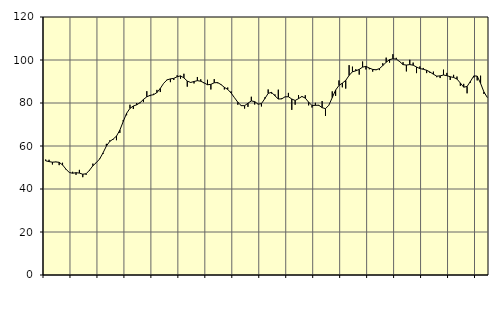
| Category | Piggar | Series 1 |
|---|---|---|
| nan | 53.7 | 53.11 |
| 87.0 | 53.6 | 52.75 |
| 87.0 | 51.4 | 52.47 |
| 87.0 | 52.7 | 52.59 |
| nan | 51.1 | 52.42 |
| 88.0 | 52.2 | 51.21 |
| 88.0 | 49.1 | 49.26 |
| 88.0 | 47.6 | 47.66 |
| nan | 48 | 47.34 |
| 89.0 | 46.6 | 47.58 |
| 89.0 | 48.9 | 47.41 |
| 89.0 | 45.5 | 46.87 |
| nan | 46.6 | 47.09 |
| 90.0 | 48.5 | 48.74 |
| 90.0 | 51.8 | 50.79 |
| 90.0 | 52.1 | 52.25 |
| nan | 54.1 | 53.95 |
| 91.0 | 56.3 | 56.77 |
| 91.0 | 61 | 59.95 |
| 91.0 | 62.6 | 62.14 |
| nan | 63 | 63.2 |
| 92.0 | 62.7 | 64.6 |
| 92.0 | 66.1 | 67.39 |
| 92.0 | 72.1 | 71.39 |
| nan | 74.3 | 75.21 |
| 93.0 | 79.2 | 77.5 |
| 93.0 | 77.2 | 78.6 |
| 93.0 | 80 | 79.16 |
| nan | 79.9 | 80.17 |
| 94.0 | 80.4 | 81.65 |
| 94.0 | 85.5 | 82.88 |
| 94.0 | 83.2 | 83.59 |
| nan | 84.3 | 83.87 |
| 95.0 | 86.1 | 84.85 |
| 95.0 | 85.1 | 86.79 |
| 95.0 | 89.2 | 89.17 |
| nan | 90.9 | 90.75 |
| 96.0 | 89.7 | 91.22 |
| 96.0 | 90.7 | 91.46 |
| 96.0 | 92.9 | 92.21 |
| nan | 91.3 | 92.62 |
| 97.0 | 93.6 | 91.69 |
| 97.0 | 87.6 | 90.2 |
| 97.0 | 89.7 | 89.55 |
| nan | 89.1 | 90 |
| 98.0 | 92.1 | 90.39 |
| 98.0 | 91 | 90.12 |
| 98.0 | 89.2 | 89.36 |
| nan | 90.8 | 88.49 |
| 99.0 | 86.3 | 88.67 |
| 99.0 | 91.1 | 89.41 |
| 99.0 | 89.2 | 89.5 |
| nan | 88.4 | 88.58 |
| 0.0 | 86.3 | 87.29 |
| 0.0 | 87.2 | 86.32 |
| 0.0 | 85.4 | 84.65 |
| nan | 82.5 | 82.47 |
| 1.0 | 79.2 | 80.34 |
| 1.0 | 79 | 78.79 |
| 1.0 | 77.4 | 78.75 |
| nan | 78.2 | 79.91 |
| 2.0 | 82.9 | 80.96 |
| 2.0 | 79.3 | 80.65 |
| 2.0 | 79.6 | 79.46 |
| nan | 78.4 | 79.72 |
| 3.0 | 82.6 | 82.02 |
| 3.0 | 86.3 | 84.48 |
| 3.0 | 84.4 | 84.96 |
| nan | 84 | 83.35 |
| 4.0 | 86.2 | 81.86 |
| 4.0 | 82.2 | 81.92 |
| 4.0 | 82.8 | 82.87 |
| nan | 84.7 | 82.92 |
| 5.0 | 76.8 | 81.85 |
| 5.0 | 79.2 | 81.19 |
| 5.0 | 83.7 | 82.03 |
| nan | 82.8 | 83.04 |
| 6.0 | 83.6 | 82.28 |
| 6.0 | 78.9 | 80.36 |
| 6.0 | 77.9 | 78.85 |
| nan | 80.1 | 78.91 |
| 7.0 | 78.7 | 78.96 |
| 7.0 | 80.9 | 77.83 |
| 7.0 | 74 | 77.37 |
| nan | 79 | 78.97 |
| 8.0 | 85.4 | 82.52 |
| 8.0 | 83.3 | 86.02 |
| 8.0 | 90.5 | 88.16 |
| nan | 87.3 | 89.24 |
| 9.0 | 86.7 | 90.51 |
| 9.0 | 97.6 | 92.83 |
| 9.0 | 96.9 | 94.53 |
| nan | 95.7 | 94.96 |
| 10.0 | 93.2 | 95.63 |
| 10.0 | 99.3 | 96.68 |
| 10.0 | 95.6 | 97.03 |
| nan | 95.7 | 96.26 |
| 11.0 | 94.6 | 95.62 |
| 11.0 | 95.3 | 95.45 |
| 11.0 | 95.3 | 95.99 |
| nan | 98.5 | 97.42 |
| 12.0 | 101.1 | 98.94 |
| 12.0 | 98.8 | 100.16 |
| 12.0 | 102.7 | 100.58 |
| nan | 101 | 100.41 |
| 13.0 | 99.1 | 99.25 |
| 13.0 | 99 | 97.86 |
| 13.0 | 94.7 | 97.64 |
| nan | 100.1 | 97.87 |
| 14.0 | 98.8 | 97.59 |
| 14.0 | 93.9 | 96.75 |
| 14.0 | 97 | 96 |
| nan | 96.3 | 95.7 |
| 15.0 | 93.9 | 95.23 |
| 15.0 | 94 | 94.41 |
| 15.0 | 94.6 | 93.39 |
| nan | 92 | 92.49 |
| 16.0 | 91.6 | 92.61 |
| 16.0 | 95.5 | 93.02 |
| 16.0 | 94 | 92.71 |
| nan | 90.7 | 92.21 |
| 17.0 | 93.1 | 91.87 |
| 17.0 | 92.3 | 91.15 |
| 17.0 | 88 | 89.29 |
| nan | 88.9 | 87.36 |
| 18.0 | 84.5 | 87.69 |
| 18.0 | 89.5 | 90.08 |
| 18.0 | 91.9 | 92.6 |
| nan | 90.5 | 92.51 |
| 19.0 | 92.7 | 89.16 |
| 19.0 | 84.2 | 85.12 |
| 19.0 | 82.5 | 82.56 |